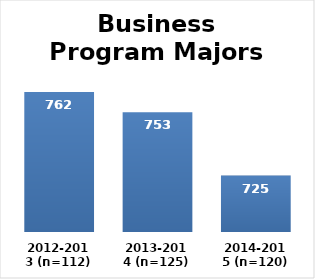
| Category | Series 0 |
|---|---|
| 2012-2013 (n=112) | 762 |
| 2013-2014 (n=125) | 753 |
| 2014-2015 (n=120) | 725 |